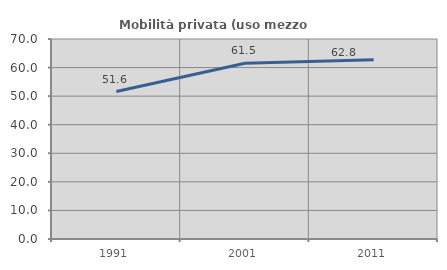
| Category | Mobilità privata (uso mezzo privato) |
|---|---|
| 1991.0 | 51.618 |
| 2001.0 | 61.482 |
| 2011.0 | 62.766 |